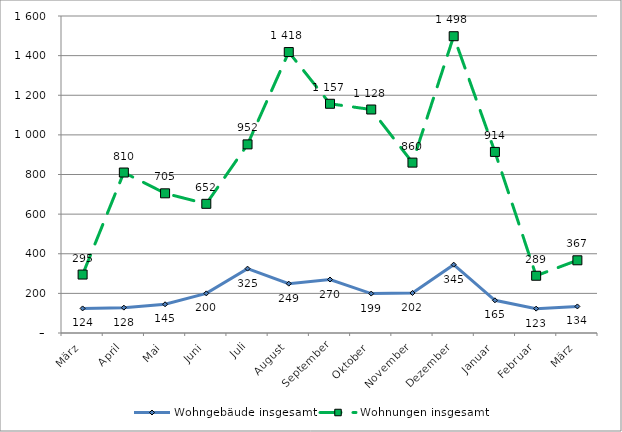
| Category | Wohngebäude insgesamt | Wohnungen insgesamt |
|---|---|---|
| März | 124 | 295 |
| April | 128 | 810 |
| Mai | 145 | 705 |
| Juni | 200 | 652 |
| Juli | 325 | 952 |
| August | 249 | 1418 |
| September | 270 | 1157 |
| Oktober | 199 | 1128 |
| November | 202 | 860 |
| Dezember | 345 | 1498 |
| Januar | 165 | 914 |
| Februar | 123 | 289 |
| März | 134 | 367 |